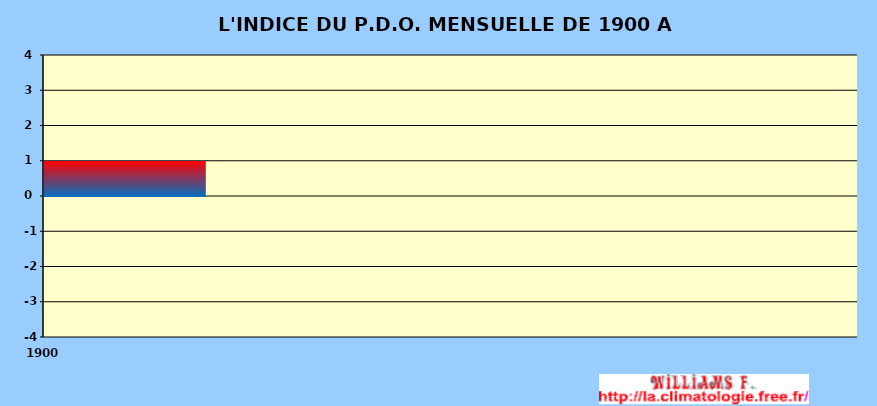
| Category | PDO |
|---|---|
| 1900-01-01 | 1 |